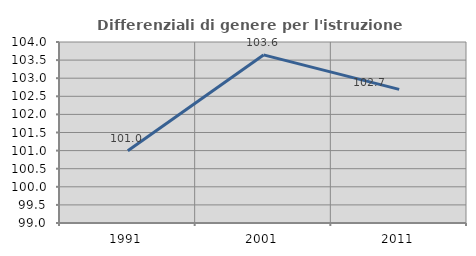
| Category | Differenziali di genere per l'istruzione superiore |
|---|---|
| 1991.0 | 100.995 |
| 2001.0 | 103.643 |
| 2011.0 | 102.691 |